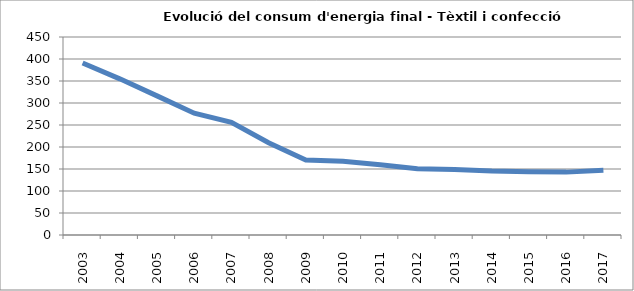
| Category | 391,0 354,9 316,2 276,8 256,2 209,6 170,4 167,8 159,6 150,6 148,9 145,2 144,0 142,9 147,3 |
|---|---|
| 2003.0 | 391 |
| 2004.0 | 354.9 |
| 2005.0 | 316.2 |
| 2006.0 | 276.8 |
| 2007.0 | 256.2 |
| 2008.0 | 209.6 |
| 2009.0 | 170.4 |
| 2010.0 | 167.8 |
| 2011.0 | 159.6 |
| 2012.0 | 150.6 |
| 2013.0 | 148.9 |
| 2014.0 | 145.2 |
| 2015.0 | 144 |
| 2016.0 | 142.9 |
| 2017.0 | 147.3 |